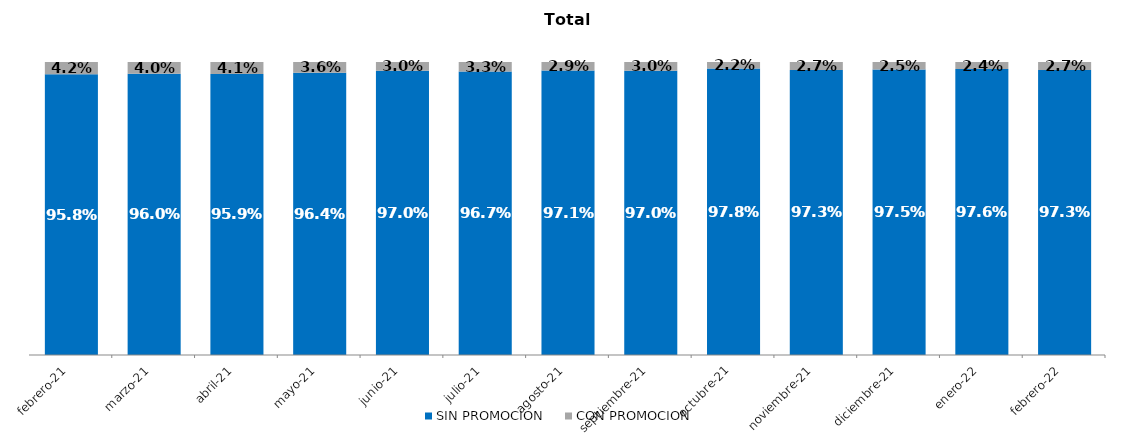
| Category | SIN PROMOCION   | CON PROMOCION   |
|---|---|---|
| 2021-02-01 | 0.958 | 0.042 |
| 2021-03-01 | 0.96 | 0.04 |
| 2021-04-01 | 0.959 | 0.041 |
| 2021-05-01 | 0.964 | 0.036 |
| 2021-06-01 | 0.97 | 0.03 |
| 2021-07-01 | 0.967 | 0.033 |
| 2021-08-01 | 0.971 | 0.029 |
| 2021-09-01 | 0.97 | 0.03 |
| 2021-10-01 | 0.978 | 0.022 |
| 2021-11-01 | 0.973 | 0.027 |
| 2021-12-01 | 0.975 | 0.025 |
| 2022-01-01 | 0.976 | 0.024 |
| 2022-02-01 | 0.973 | 0.027 |